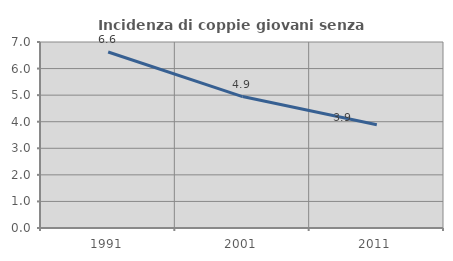
| Category | Incidenza di coppie giovani senza figli |
|---|---|
| 1991.0 | 6.623 |
| 2001.0 | 4.947 |
| 2011.0 | 3.886 |